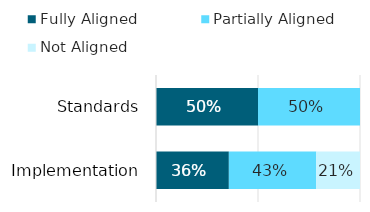
| Category | Fully Aligned | Partially Aligned | Not Aligned |
|---|---|---|---|
| Standards | 0.5 | 0.5 | 0 |
| Implementation | 0.357 | 0.429 | 0.214 |